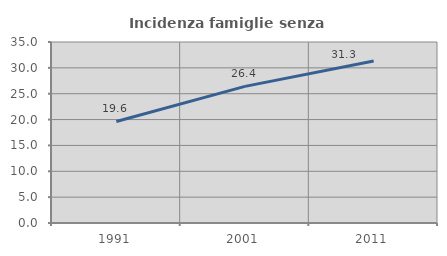
| Category | Incidenza famiglie senza nuclei |
|---|---|
| 1991.0 | 19.641 |
| 2001.0 | 26.422 |
| 2011.0 | 31.315 |